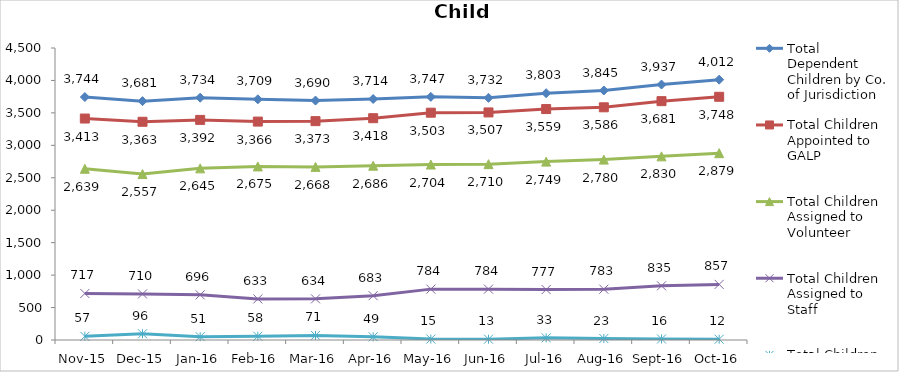
| Category | Total Dependent Children by Co. of Jurisdiction | Total Children Appointed to GALP | Total Children Assigned to Volunteer | Total Children Assigned to Staff | Total Children Unassigned |
|---|---|---|---|---|---|
| Nov-15 | 3744 | 3413 | 2639 | 717 | 57 |
| Dec-15 | 3681 | 3363 | 2557 | 710 | 96 |
| Jan-16 | 3734 | 3392 | 2645 | 696 | 51 |
| Feb-16 | 3709 | 3366 | 2675 | 633 | 58 |
| Mar-16 | 3690 | 3373 | 2668 | 634 | 71 |
| Apr-16 | 3714 | 3418 | 2686 | 683 | 49 |
| May-16 | 3747 | 3503 | 2704 | 784 | 15 |
| Jun-16 | 3732 | 3507 | 2710 | 784 | 13 |
| Jul-16 | 3803 | 3559 | 2749 | 777 | 33 |
| Aug-16 | 3845 | 3586 | 2780 | 783 | 23 |
| Sep-16 | 3937 | 3681 | 2830 | 835 | 16 |
| Oct-16 | 4012 | 3748 | 2879 | 857 | 12 |